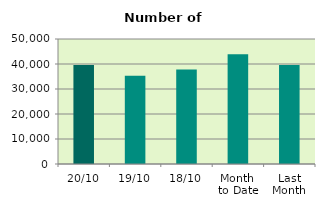
| Category | Series 0 |
|---|---|
| 20/10 | 39560 |
| 19/10 | 35278 |
| 18/10 | 37784 |
| Month 
to Date | 43915.571 |
| Last
Month | 39557.091 |